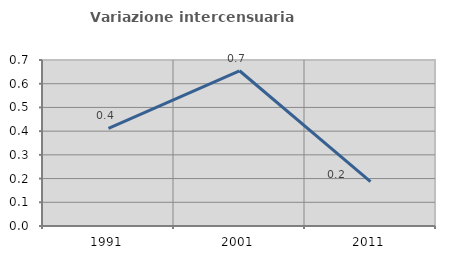
| Category | Variazione intercensuaria annua |
|---|---|
| 1991.0 | 0.412 |
| 2001.0 | 0.655 |
| 2011.0 | 0.187 |